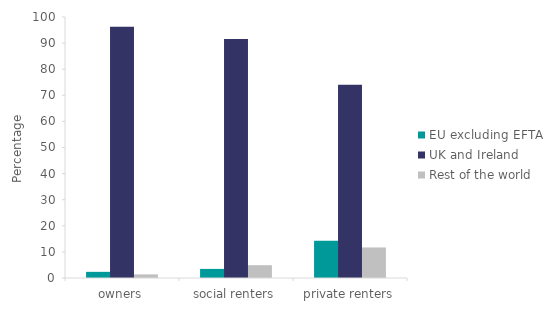
| Category | EU excluding EFTA | UK and Ireland | Rest of the world |
|---|---|---|---|
| owners | 2.357 | 96.258 | 1.385 |
| social renters | 3.482 | 91.613 | 4.905 |
| private renters | 14.228 | 74.075 | 11.698 |